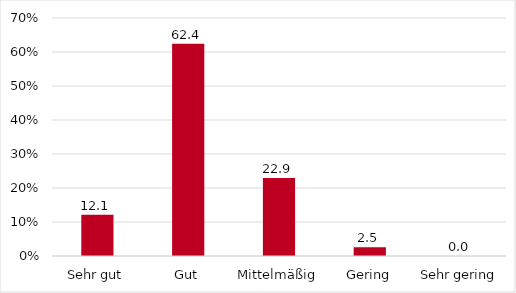
| Category | Series 0 |
|---|---|
| Sehr gut | 12.102 |
| Gut | 62.42 |
| Mittelmäßig | 22.93 |
| Gering | 2.548 |
| Sehr gering | 0 |